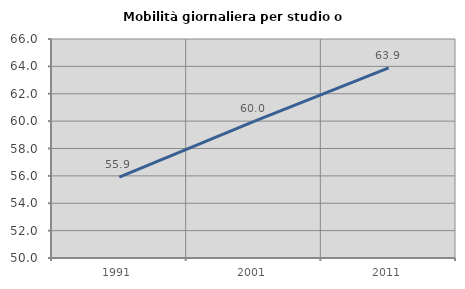
| Category | Mobilità giornaliera per studio o lavoro |
|---|---|
| 1991.0 | 55.916 |
| 2001.0 | 59.977 |
| 2011.0 | 63.895 |